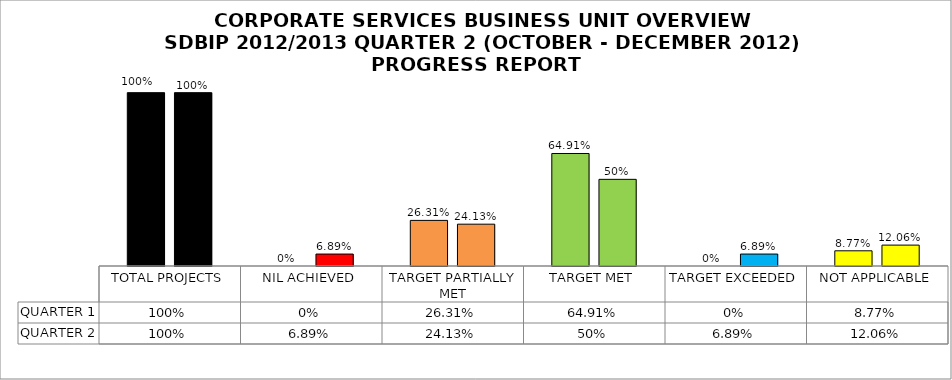
| Category | QUARTER 1 | QUARTER 2 |
|---|---|---|
| TOTAL PROJECTS | 1 | 1 |
| NIL ACHIEVED | 0 | 0.069 |
| TARGET PARTIALLY MET | 0.263 | 0.241 |
| TARGET MET | 0.649 | 0.5 |
| TARGET EXCEEDED | 0 | 0.069 |
| NOT APPLICABLE | 0.088 | 0.121 |